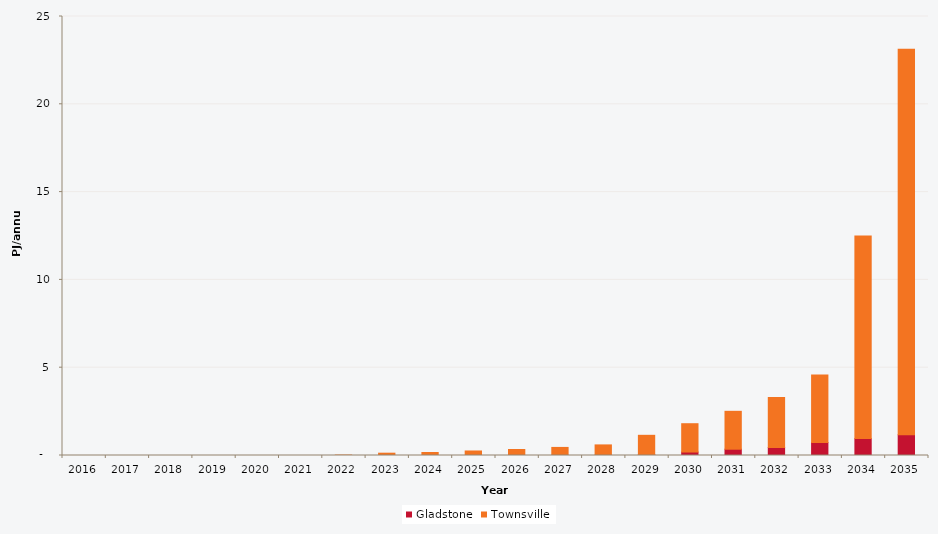
| Category | Gladstone | Townsville |
|---|---|---|
| 2016.0 | 0 | 0 |
| 2017.0 | 0 | 0 |
| 2018.0 | 0 | 0.001 |
| 2019.0 | 0 | 0 |
| 2020.0 | 0 | 0 |
| 2021.0 | 0 | 0 |
| 2022.0 | 0 | 0.025 |
| 2023.0 | 0 | 0.132 |
| 2024.0 | 0 | 0.171 |
| 2025.0 | 0 | 0.257 |
| 2026.0 | 0.003 | 0.337 |
| 2027.0 | 0.008 | 0.452 |
| 2028.0 | 0.013 | 0.59 |
| 2029.0 | 0.052 | 1.097 |
| 2030.0 | 0.197 | 1.613 |
| 2031.0 | 0.359 | 2.157 |
| 2032.0 | 0.462 | 2.844 |
| 2033.0 | 0.736 | 3.855 |
| 2034.0 | 0.962 | 11.534 |
| 2035.0 | 1.181 | 21.953 |